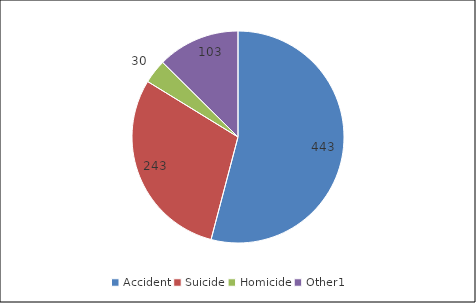
| Category | Women |
|---|---|
| Accident | 443 |
| Suicide | 243 |
| Homicide | 30 |
| Other1   | 103 |